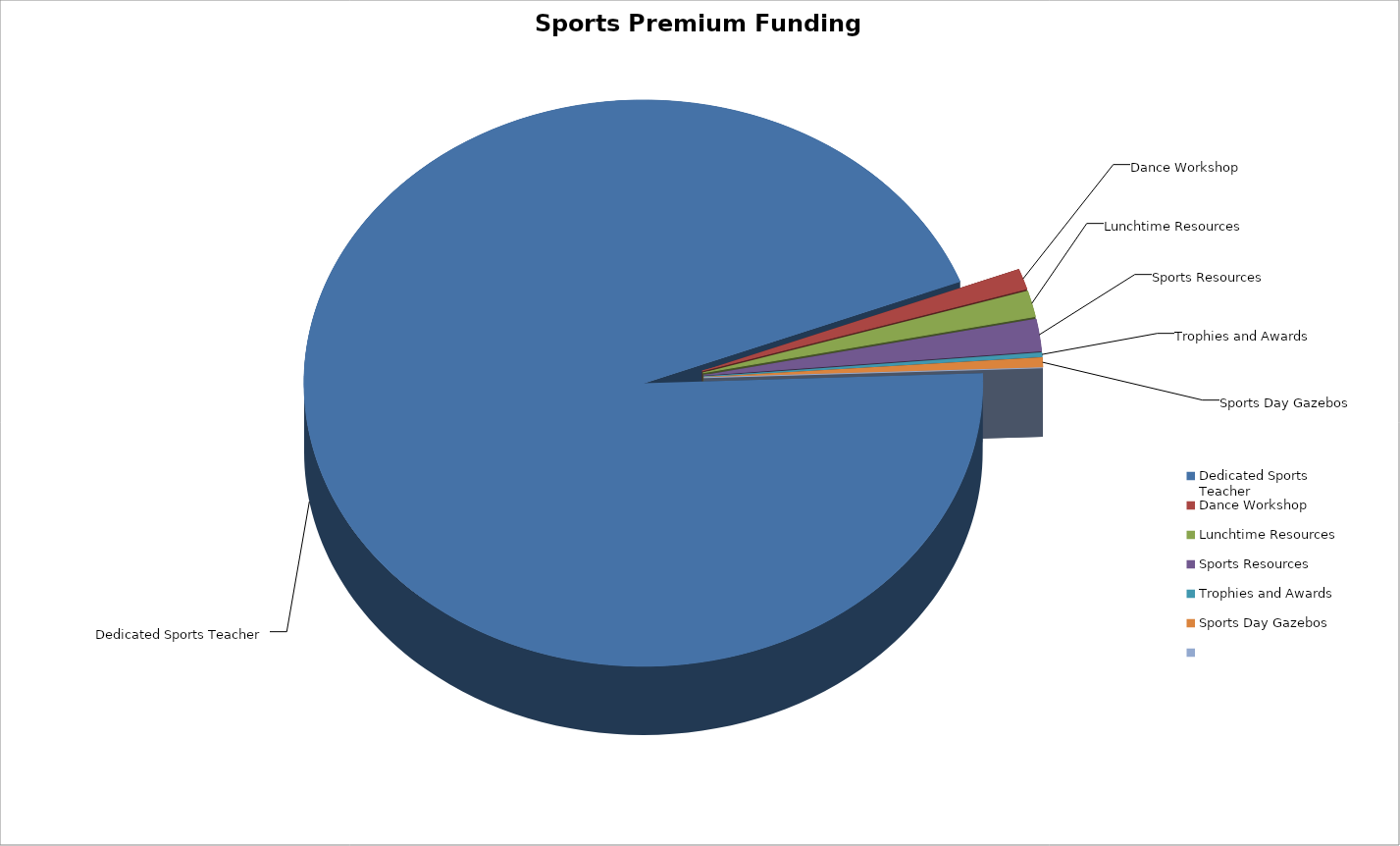
| Category | Series 0 |
|---|---|
| Dedicated Sports Teacher | 17122 |
| Dance Workshop | 212 |
| Lunchtime Resources | 270 |
| Sports Resources | 329 |
| Trophies and Awards | 43 |
| Sports Day Gazebos | 104 |